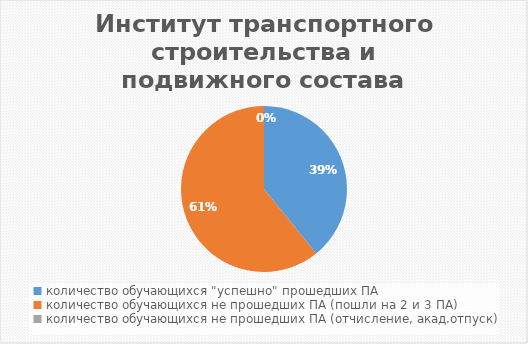
| Category | Институт транспортного строительства и подвижного состава |
|---|---|
| количество обучающихся "успешно" прошедших ПА | 375 |
| количество обучающихся не прошедших ПА (пошли на 2 и 3 ПА) | 582 |
| количество обучающихся не прошедших ПА (отчисление, акад.отпуск) | 0 |